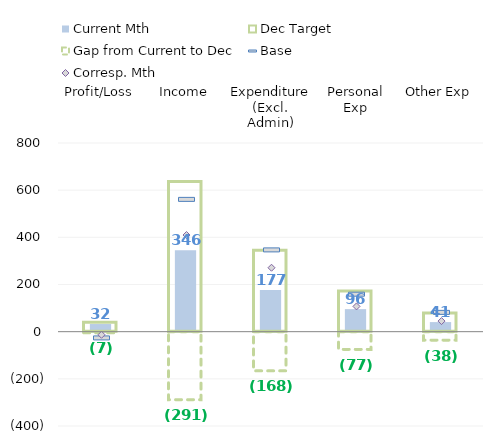
| Category | Current Mth |
|---|---|
| Profit/Loss | 32.37 |
| Income | 345.675 |
| Expenditure (Excl. Admin) | 177.085 |
| Personal Exp | 95.576 |
| Other Exp | 40.643 |